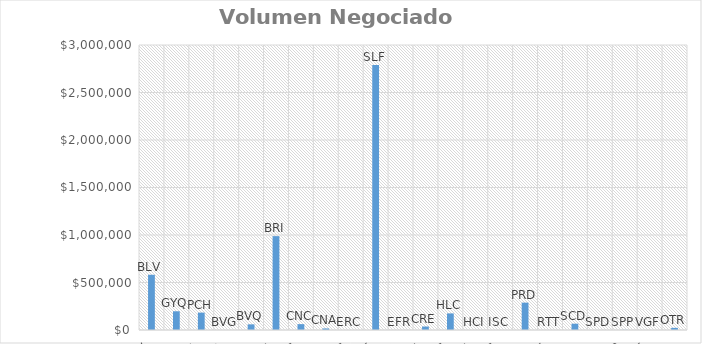
| Category | Volumen (USD) |
|---|---|
| BLV | 581311.88 |
| GYQ | 197112.43 |
| PCH | 183040 |
| BVG | 0 |
| BVQ | 59457.7 |
| BRI | 988000 |
| CNC | 61675 |
| CNA | 16417 |
| ERC | 0 |
| SLF | 2790663.28 |
| EFR | 0 |
| CRE | 36530 |
| HLC | 174580 |
| HCI | 0 |
| ISC | 0 |
| PRD | 287942.74 |
| RTT | 0 |
| SCD | 66348.75 |
| SPD | 0 |
| SPP | 1615 |
| VGF | 0 |
| OTR | 22555.36 |